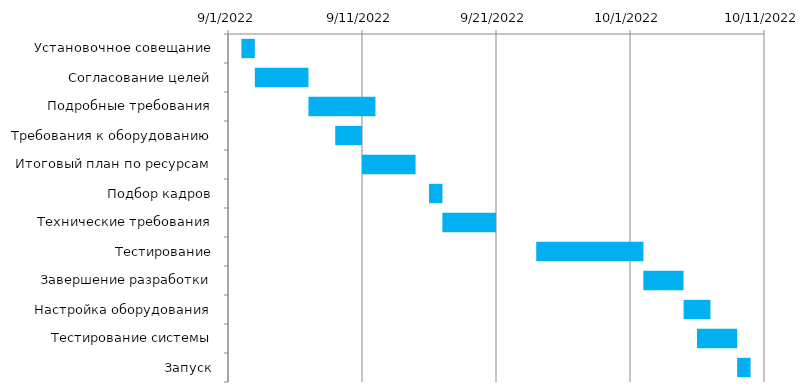
| Category | Начало | Дни |
|---|---|---|
| Установочное совещание | 9/2/22 | 1 |
| Согласование целей | 9/3/22 | 4 |
| Подробные требования | 9/7/22 | 5 |
| Требования к оборудованию | 9/9/22 | 2 |
| Итоговый план по ресурсам | 9/11/22 | 4 |
| Подбор кадров | 9/16/22 | 1 |
| Технические требования | 9/17/22 | 4 |
| Тестирование | 9/24/22 | 8 |
| Завершение разработки | 10/2/22 | 3 |
| Настройка оборудования | 10/5/22 | 2 |
| Тестирование системы | 10/6/22 | 3 |
| Запуск | 10/9/22 | 1 |